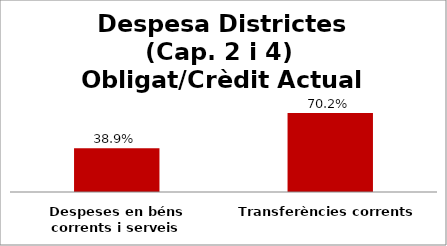
| Category | Series 0 |
|---|---|
| Despeses en béns corrents i serveis | 0.389 |
| Transferències corrents | 0.702 |